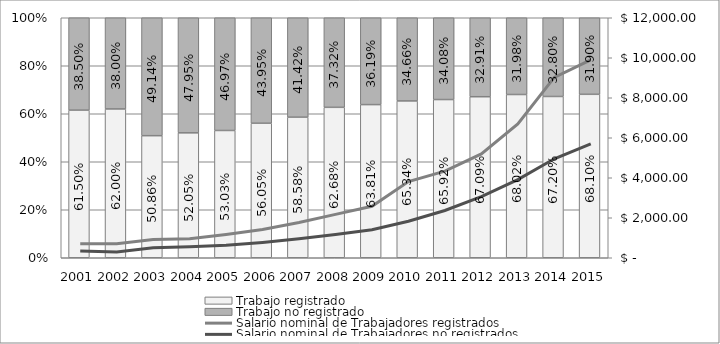
| Category | Trabajo registrado  | Trabajo no registrado |
|---|---|---|
| 2001.0 | 0.615 | 0.385 |
| 2002.0 | 0.62 | 0.38 |
| 2003.0 | 0.509 | 0.491 |
| 2004.0 | 0.52 | 0.48 |
| 2005.0 | 0.53 | 0.47 |
| 2006.0 | 0.56 | 0.44 |
| 2007.0 | 0.586 | 0.414 |
| 2008.0 | 0.627 | 0.373 |
| 2009.0 | 0.638 | 0.362 |
| 2010.0 | 0.653 | 0.347 |
| 2011.0 | 0.659 | 0.341 |
| 2012.0 | 0.671 | 0.329 |
| 2013.0 | 0.68 | 0.32 |
| 2014.0 | 0.672 | 0.328 |
| 2015.0 | 0.681 | 0.319 |